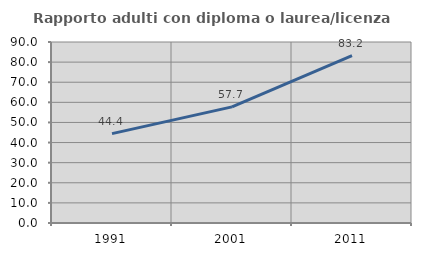
| Category | Rapporto adulti con diploma o laurea/licenza media  |
|---|---|
| 1991.0 | 44.444 |
| 2001.0 | 57.727 |
| 2011.0 | 83.206 |